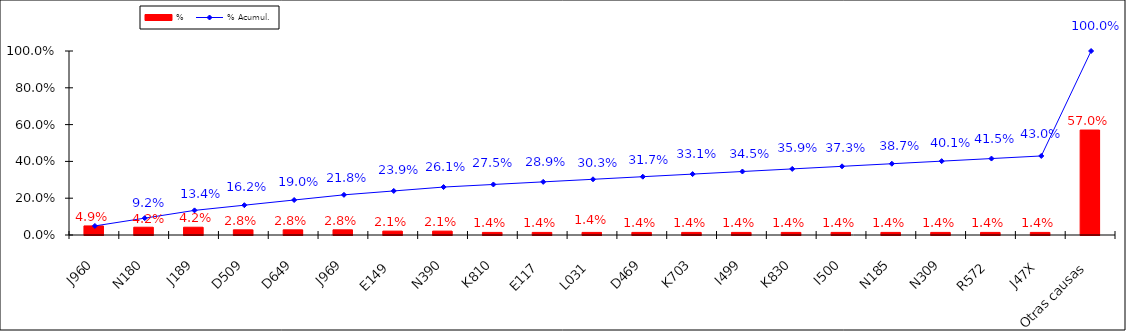
| Category | % |
|---|---|
| J960 | 0.049 |
| N180 | 0.042 |
| J189 | 0.042 |
| D509 | 0.028 |
| D649 | 0.028 |
| J969 | 0.028 |
| E149 | 0.021 |
| N390 | 0.021 |
| K810 | 0.014 |
| E117 | 0.014 |
| L031 | 0.014 |
| D469 | 0.014 |
| K703 | 0.014 |
| I499 | 0.014 |
| K830 | 0.014 |
| I500 | 0.014 |
| N185 | 0.014 |
| N309 | 0.014 |
| R572 | 0.014 |
| J47X | 0.014 |
| Otras causas | 0.57 |